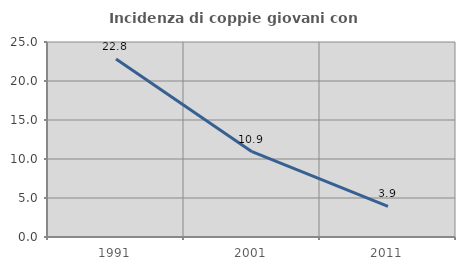
| Category | Incidenza di coppie giovani con figli |
|---|---|
| 1991.0 | 22.807 |
| 2001.0 | 10.938 |
| 2011.0 | 3.933 |